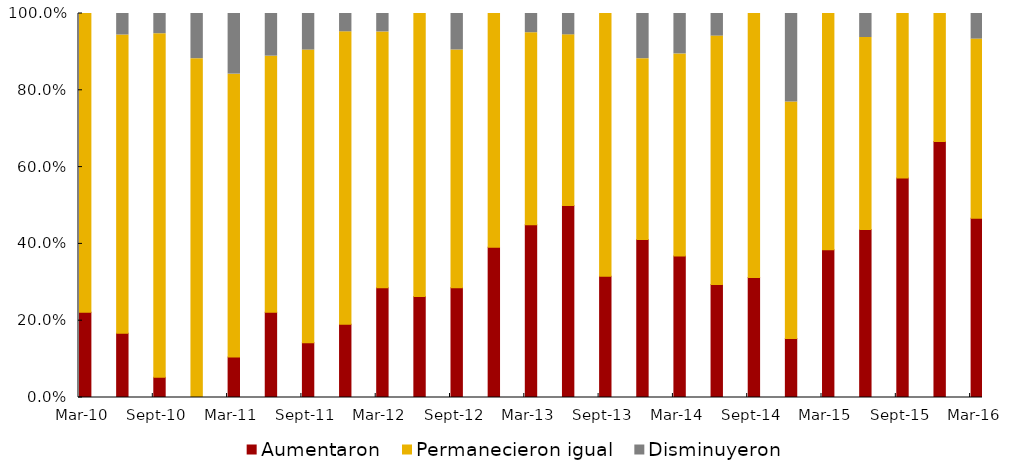
| Category | Aumentaron | Permanecieron igual | Disminuyeron |
|---|---|---|---|
| 2009-12-01 | 0.412 | 0.529 | 0.059 |
| 2010-03-01 | 0.222 | 0.778 | 0 |
| 2010-06-01 | 0.167 | 0.777 | 0.056 |
| 2010-09-01 | 0.053 | 0.895 | 0.053 |
| 2010-12-01 | 0 | 0.882 | 0.118 |
| 2011-03-01 | 0.105 | 0.737 | 0.158 |
| 2011-06-01 | 0.222 | 0.667 | 0.111 |
| 2011-09-01 | 0.143 | 0.762 | 0.095 |
| 2011-12-01 | 0.19 | 0.762 | 0.048 |
| 2012-03-01 | 0.286 | 0.666 | 0.048 |
| 2012-06-01 | 0.263 | 0.737 | 0 |
| 2012-09-01 | 0.286 | 0.619 | 0.095 |
| 2012-12-01 | 0.391 | 0.609 | 0 |
| 2013-03-01 | 0.45 | 0.5 | 0.05 |
| 2013-06-01 | 0.5 | 0.444 | 0.056 |
| 2013-09-01 | 0.316 | 0.684 | 0 |
| 2013-12-01 | 0.412 | 0.471 | 0.118 |
| 2014-03-01 | 0.368 | 0.526 | 0.105 |
| 2014-06-01 | 0.294 | 0.647 | 0.059 |
| 2014-09-01 | 0.312 | 0.688 | 0 |
| 2014-12-01 | 0.154 | 0.615 | 0.231 |
| 2015-03-01 | 0.385 | 0.615 | 0 |
| 2015-06-01 | 0.438 | 0.5 | 0.062 |
| 2015-09-01 | 0.571 | 0.429 | 0 |
| 2015-12-01 | 0.667 | 0.333 | 0 |
| 2016-03-01 | 0.467 | 0.467 | 0.067 |